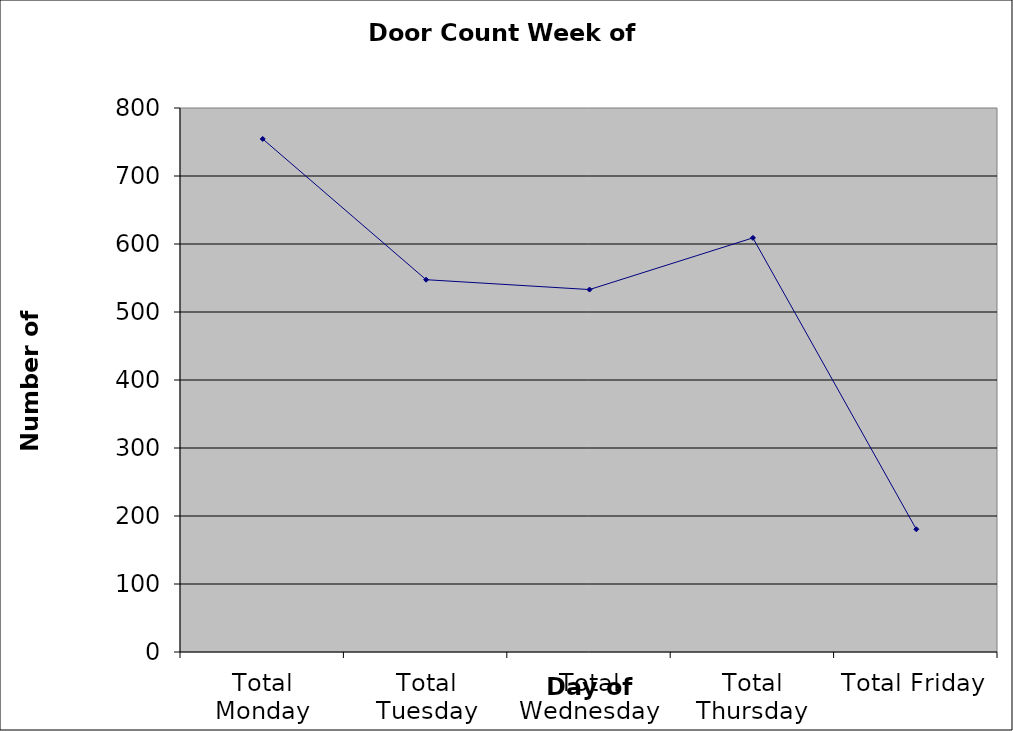
| Category | Series 0 |
|---|---|
| Total Monday | 754.5 |
| Total Tuesday | 547.5 |
| Total Wednesday | 533 |
| Total Thursday | 609 |
| Total Friday | 180.5 |